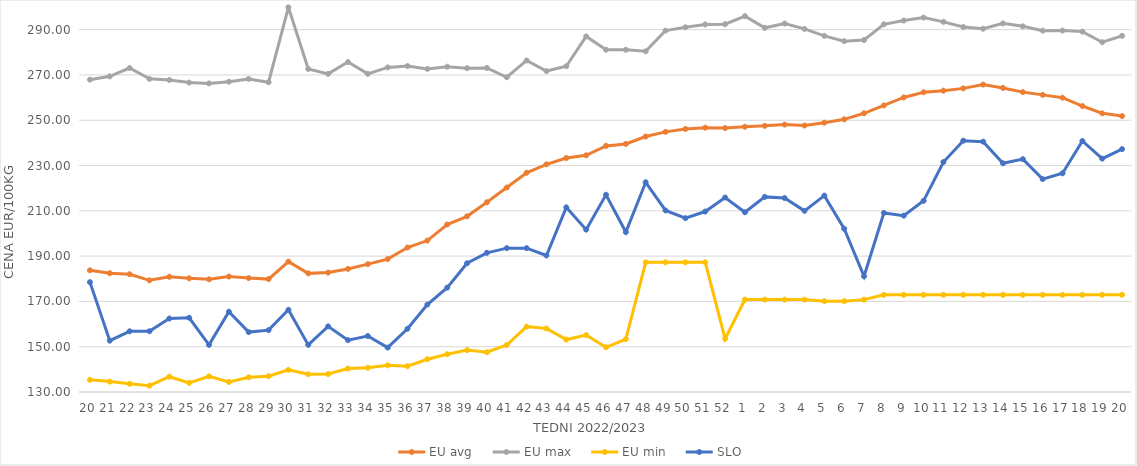
| Category | EU avg | EU max | EU min | SLO |
|---|---|---|---|---|
| 20.0 | 183.734 | 267.92 | 135.392 | 178.51 |
| 21.0 | 182.45 | 269.38 | 134.589 | 152.67 |
| 22.0 | 181.991 | 273.06 | 133.621 | 156.8 |
| 23.0 | 179.308 | 268.27 | 132.787 | 156.84 |
| 24.0 | 180.886 | 267.77 | 136.75 | 162.44 |
| 25.0 | 180.2 | 266.63 | 134.058 | 162.78 |
| 26.0 | 179.77 | 266.27 | 136.895 | 150.82 |
| 27.0 | 180.992 | 267.02 | 134.44 | 165.45 |
| 28.0 | 180.305 | 268.25 | 136.486 | 156.46 |
| 29.0 | 179.847 | 266.77 | 136.97 | 157.31 |
| 30.0 | 187.576 | 299.87 | 139.777 | 166.29 |
| 31.0 | 182.385 | 272.64 | 137.828 | 150.81 |
| 32.0 | 182.73 | 270.47 | 137.934 | 158.99 |
| 33.0 | 184.343 | 275.68 | 140.33 | 152.91 |
| 34.0 | 186.448 | 270.49 | 140.7 | 154.73 |
| 35.0 | 188.684 | 273.33 | 141.78 | 149.6 |
| 36.0 | 193.792 | 273.91 | 141.41 | 157.93 |
| 37.0 | 196.877 | 272.67 | 144.47 | 168.61 |
| 38.0 | 203.962 | 273.63 | 146.68 | 176.07 |
| 39.0 | 207.574 | 272.98 | 148.499 | 186.86 |
| 40.0 | 213.785 | 273.1 | 147.54 | 191.45 |
| 41.0 | 220.272 | 268.98 | 150.75 | 193.52 |
| 42.0 | 226.803 | 276.39 | 158.87 | 193.52 |
| 43.0 | 230.521 | 271.72 | 158.04 | 190.28 |
| 44.0 | 233.325 | 273.856 | 153.16 | 211.53 |
| 45.0 | 234.517 | 287.021 | 155.13 | 201.69 |
| 46.0 | 238.669 | 281.133 | 149.75 | 217.08 |
| 47.0 | 239.534 | 281.102 | 153.36 | 200.62 |
| 48.0 | 242.81 | 280.434 | 187.26 | 222.61 |
| 49.0 | 244.854 | 289.585 | 187.26 | 210.16 |
| 50.0 | 246.132 | 291.057 | 187.26 | 206.76 |
| 51.0 | 246.705 | 292.307 | 187.26 | 209.69 |
| 52.0 | 246.546 | 292.426 | 153.54 | 215.87 |
| 1.0 | 247.118 | 295.98 | 170.79 | 209.37 |
| 2.0 | 247.516 | 290.8 | 170.79 | 216.15 |
| 3.0 | 248.079 | 292.71 | 170.79 | 215.63 |
| 4.0 | 247.672 | 290.32 | 170.79 | 210 |
| 5.0 | 248.924 | 287.27 | 170.09 | 216.7 |
| 6.0 | 250.4 | 284.92 | 170.09 | 202.1 |
| 7.0 | 253.074 | 285.42 | 170.79 | 181.11 |
| 8.0 | 256.543 | 292.35 | 172.91 | 209.08 |
| 9.0 | 260.066 | 294.02 | 172.91 | 207.87 |
| 10.0 | 262.352 | 295.33 | 172.91 | 214.42 |
| 11.0 | 263.049 | 293.44 | 172.91 | 231.56 |
| 12.0 | 264.068 | 291.15 | 172.91 | 240.97 |
| 13.0 | 265.73 | 290.38 | 172.91 | 240.55 |
| 14.0 | 264.262 | 292.763 | 172.91 | 230.99 |
| 15.0 | 262.411 | 291.46 | 172.91 | 232.82 |
| 16.0 | 261.202 | 289.56 | 172.91 | 224 |
| 17.0 | 259.958 | 289.61 | 172.91 | 226.57 |
| 18.0 | 256.275 | 289.13 | 172.91 | 240.83 |
| 19.0 | 253.052 | 284.45 | 172.91 | 233.05 |
| 20.0 | 251.839 | 287.26 | 172.91 | 237.25 |